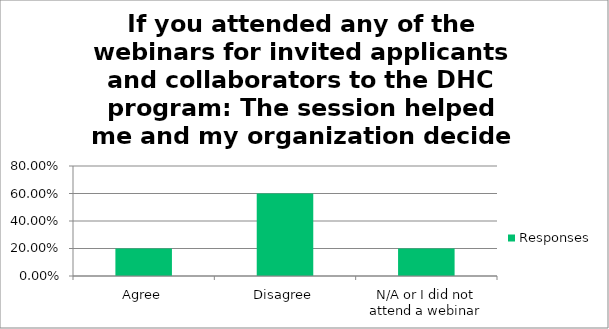
| Category | Responses |
|---|---|
| Agree | 0.2 |
| Disagree | 0.6 |
| N/A or I did not attend a webinar | 0.2 |